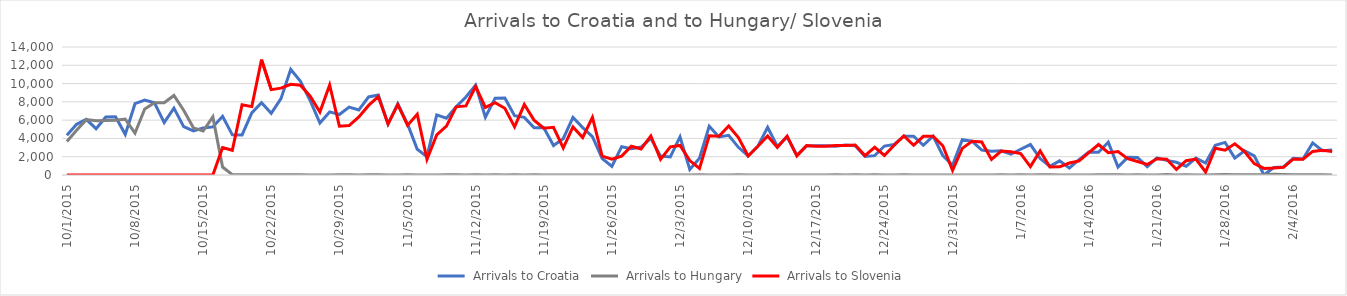
| Category | Series 0 | Series 1 | Series 2 |
|---|---|---|---|
| 10/1/15 | 4344 | 3667 | 0 |
| 10/2/15 | 5546 | 4897 | 0 |
| 10/3/15 | 6086 | 6056 | 0 |
| 10/4/15 | 5065 | 5925 | 0 |
| 10/5/15 | 6338 | 5952 | 0 |
| 10/6/15 | 6370 | 6000 | 0 |
| 10/7/15 | 4446 | 6103 | 0 |
| 10/8/15 | 7798 | 4583 | 6 |
| 10/9/15 | 8201 | 7215 | 0 |
| 10/10/15 | 7896 | 7907 | 0 |
| 10/11/15 | 5732 | 7897 | 0 |
| 10/12/15 | 7317 | 8702 | 0 |
| 10/13/15 | 5286 | 7081 | 0 |
| 10/14/15 | 4814 | 5157 | 0 |
| 10/15/15 | 5138 | 4808 | 0 |
| 10/16/15 | 5260 | 6353 | 0 |
| 10/17/15 | 6415 | 870 | 3000 |
| 10/18/15 | 4390 | 41 | 2700 |
| 10/19/15 | 4388 | 22 | 7677 |
| 10/20/15 | 6793 | 36 | 7478 |
| 10/21/15 | 7900 | 39 | 12616 |
| 10/22/15 | 6748 | 32 | 9339 |
| 10/23/15 | 8348 | 29 | 9500 |
| 10/24/15 | 11570 | 35 | 9925 |
| 10/25/15 | 10249 | 34 | 9818 |
| 10/26/15 | 8128 | 12 | 8625 |
| 10/27/15 | 5683 | 7 | 6877 |
| 10/28/15 | 6900 | 4 | 9848 |
| 10/29/15 | 6615 | 23 | 5341 |
| 10/30/15 | 7429 | 18 | 5409 |
| 10/31/15 | 7110 | 10 | 6344 |
| 11/1/15 | 8534 | 14 | 7611 |
| 11/2/15 | 8746 | 31 | 8568 |
| 11/3/15 | 5573 | 8 | 5591 |
| 11/4/15 | 7792 | 10 | 7693 |
| 11/5/15 | 5587 | 18 | 5426 |
| 11/6/15 | 2809 | 4 | 6655 |
| 11/7/15 | 2000 | 8 | 1716 |
| 11/8/15 | 6579 | 9 | 4381 |
| 11/9/15 | 6214 | 25 | 5341 |
| 11/10/15 | 7474 | 14 | 7457 |
| 11/11/15 | 8524 | 13 | 7554 |
| 11/12/15 | 9823 | 23 | 9681 |
| 11/13/15 | 6314 | 6 | 7397 |
| 11/14/15 | 8405 | 21 | 7905 |
| 11/15/15 | 8415 | 8 | 7300 |
| 11/16/15 | 6490 | 15 | 5261 |
| 11/17/15 | 6304 | 5 | 7704 |
| 11/18/15 | 5180 | 15 | 5998 |
| 11/19/15 | 5167 | 4 | 5119 |
| 11/20/15 | 3230 | 9 | 5211 |
| 11/21/15 | 3977 | 2 | 2952 |
| 11/22/15 | 6305 | 11 | 5260 |
| 11/23/15 | 5184 | 4 | 4102 |
| 11/24/15 | 4203 | 4 | 6297 |
| 11/25/15 | 1808 | 6 | 2070 |
| 11/26/15 | 952 | 10 | 1742 |
| 11/27/15 | 3095 | 2 | 2065 |
| 11/28/15 | 2886 | 6 | 3139 |
| 11/29/15 | 3060 | 3 | 2843 |
| 11/30/15 | 4009 | 7 | 4274 |
| 12/1/15 | 2066 | 4 | 1709 |
| 12/2/15 | 1982 | 4 | 3077 |
| 12/3/15 | 4174 | 9 | 3237 |
| 12/4/15 | 611 | 1 | 1577 |
| 12/5/15 | 1835 | 31 | 715 |
| 12/6/15 | 5339 | 7 | 4288 |
| 12/7/15 | 4162 | 0 | 4240 |
| 12/8/15 | 4335 | 13 | 5351 |
| 12/9/15 | 3027 | 14 | 4103 |
| 12/10/15 | 2076 | 3 | 2078 |
| 12/11/15 | 3149 | 0 | 3149 |
| 12/12/15 | 5225 | 13 | 4271 |
| 12/13/15 | 3112 | 10 | 3016 |
| 12/14/15 | 4174 | 3 | 4250 |
| 12/15/15 | 2160 | 2 | 2098 |
| 12/16/15 | 3177 | 6 | 3214 |
| 12/17/15 | 3192 | 0 | 3135 |
| 12/18/15 | 3200 | 11 | 3150 |
| 12/19/15 | 3156 | 31 | 3222 |
| 12/20/15 | 3276 | 8 | 3233 |
| 12/21/15 | 3210 | 25 | 3278 |
| 12/22/15 | 2027 | 1 | 2118 |
| 12/23/15 | 2116 | 21 | 3030 |
| 12/24/15 | 3166 | 8 | 2131 |
| 12/25/15 | 3339 | 2 | 3257 |
| 12/26/15 | 4241 | 17 | 4274 |
| 12/27/15 | 4251 | 10 | 3253 |
| 12/28/15 | 3249 | 0 | 4228 |
| 12/29/15 | 4253 | 0 | 4239 |
| 12/30/15 | 2132 | 11 | 3195 |
| 12/31/15 | 1058 | 5 | 511 |
| 1/1/16 | 3869 | 0 | 2914 |
| 1/2/16 | 3710 | 0 | 3690 |
| 1/3/16 | 2732 | 0 | 3619 |
| 1/4/16 | 2591 | 0 | 1708 |
| 1/5/16 | 2650 | 18 | 2626 |
| 1/6/16 | 2273 | 5 | 2550 |
| 1/7/16 | 2814 | 31 | 2337 |
| 1/8/16 | 3332 | 0 | 916 |
| 1/9/16 | 1799 | 15 | 2630 |
| 1/10/16 | 942 | 28 | 880 |
| 1/11/16 | 1549 | 7 | 897 |
| 1/12/16 | 769 | 2 | 1308 |
| 1/13/16 | 1679 | 0 | 1544 |
| 1/14/16 | 2502 | 4 | 2449 |
| 1/15/16 | 2493 | 30 | 3330 |
| 1/16/16 | 3579 | 30 | 2435 |
| 1/17/16 | 878 | 30 | 2570 |
| 1/18/16 | 1930 | 9 | 1783 |
| 1/19/16 | 1917 | 29 | 1476 |
| 1/20/16 | 914 | 0 | 1154 |
| 1/21/16 | 1865 | 10 | 1787 |
| 1/22/16 | 1599 | 47 | 1738 |
| 1/23/16 | 1394 | 10 | 606 |
| 1/24/16 | 946 | 15 | 1564 |
| 1/25/16 | 1847 | 5 | 1746 |
| 1/26/16 | 1309 | 4 | 326 |
| 1/27/16 | 3256 | 36 | 2935 |
| 1/28/16 | 3565 | 51 | 2719 |
| 1/29/16 | 1843 | 38 | 3416 |
| 1/30/16 | 2641 | 38 | 2556 |
| 1/31/16 | 2098 | 38 | 1249 |
| 2/1/16 | 0 | 31 | 716 |
| 2/2/16 | 822 | 69 | 765 |
| 2/3/16 | 881 | 46 | 841 |
| 2/4/16 | 1836 | 31 | 1733 |
| 2/5/16 | 1750 | 40 | 1713 |
| 2/6/16 | 3510 | 40 | 2580 |
| 2/7/16 | 2658 | 40 | 2694 |
| 2/8/16 | 2736 | 0 | 2582 |